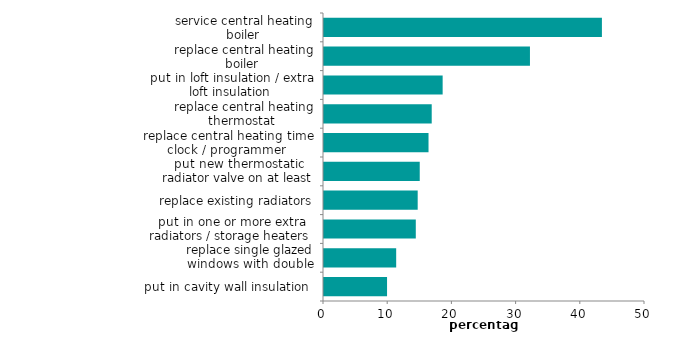
| Category | Series 0 |
|---|---|
| put in cavity wall insulation  | 9.821 |
| replace single glazed windows with double glazing  | 11.243 |
| put in one or more extra radiators / storage heaters  | 14.298 |
| replace existing radiators | 14.593 |
| put new thermostatic radiator valve on at least half of radiators  | 14.913 |
| replace central heating time clock / programmer  | 16.28 |
| replace central heating thermostat  | 16.778 |
| put in loft insulation / extra loft insulation  | 18.481 |
| replace central heating boiler  | 32.08 |
| service central heating boiler  | 43.288 |